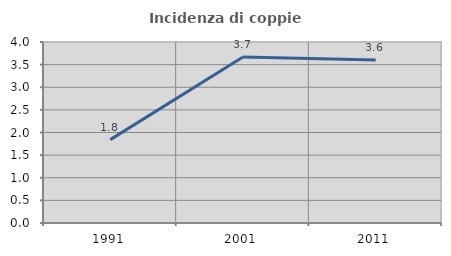
| Category | Incidenza di coppie miste |
|---|---|
| 1991.0 | 1.842 |
| 2001.0 | 3.67 |
| 2011.0 | 3.602 |